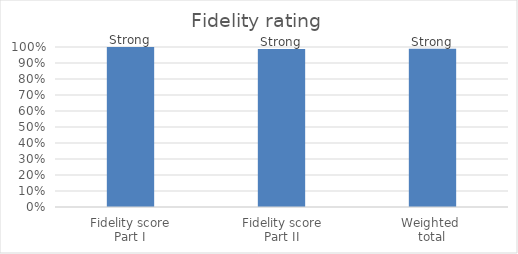
| Category | Series 0 |
|---|---|
| Fidelity score
Part I | 1 |
| Fidelity score
Part II | 0.988 |
| Weighted 
total | 0.99 |